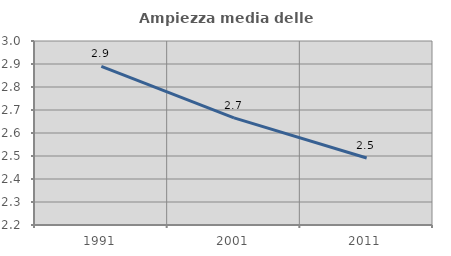
| Category | Ampiezza media delle famiglie |
|---|---|
| 1991.0 | 2.89 |
| 2001.0 | 2.666 |
| 2011.0 | 2.491 |